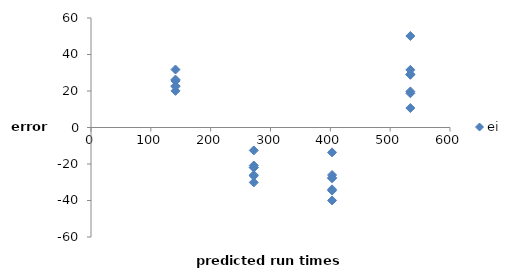
| Category | ei |
|---|---|
| 141.22142857142856 | 25.579 |
| 141.22142857142856 | 22.779 |
| 141.22142857142856 | 26.279 |
| 141.22142857142856 | 25.479 |
| 141.22142857142856 | 20.079 |
| 141.22142857142856 | 31.779 |
| 141.22142857142856 | 22.479 |
| 272.05892857142857 | -21.859 |
| 272.05892857142857 | -26.059 |
| 272.05892857142857 | -20.809 |
| 272.05892857142857 | -22.009 |
| 272.05892857142857 | -30.109 |
| 272.05892857142857 | -12.559 |
| 272.05892857142857 | -26.509 |
| 402.8964285714286 | -27.596 |
| 402.8964285714286 | -33.896 |
| 402.8964285714286 | -26.021 |
| 402.8964285714286 | -27.821 |
| 402.8964285714286 | -39.971 |
| 402.8964285714286 | -13.646 |
| 402.8964285714286 | -34.571 |
| 533.7339285714286 | 29.216 |
| 533.7339285714286 | 19.766 |
| 533.7339285714286 | 31.579 |
| 533.7339285714286 | 28.879 |
| 533.7339285714286 | 10.654 |
| 533.7339285714286 | 50.141 |
| 533.7339285714286 | 18.754 |